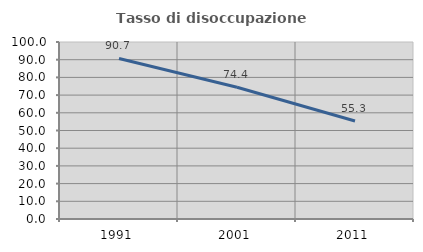
| Category | Tasso di disoccupazione giovanile  |
|---|---|
| 1991.0 | 90.683 |
| 2001.0 | 74.408 |
| 2011.0 | 55.333 |